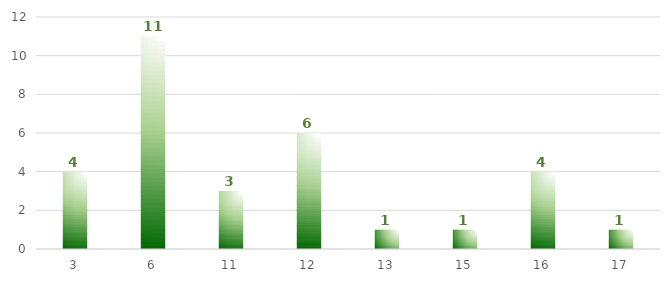
| Category | Metas |
|---|---|
| 3.0 | 4 |
| 6.0 | 11 |
| 11.0 | 3 |
| 12.0 | 6 |
| 13.0 | 1 |
| 15.0 | 1 |
| 16.0 | 4 |
| 17.0 | 1 |